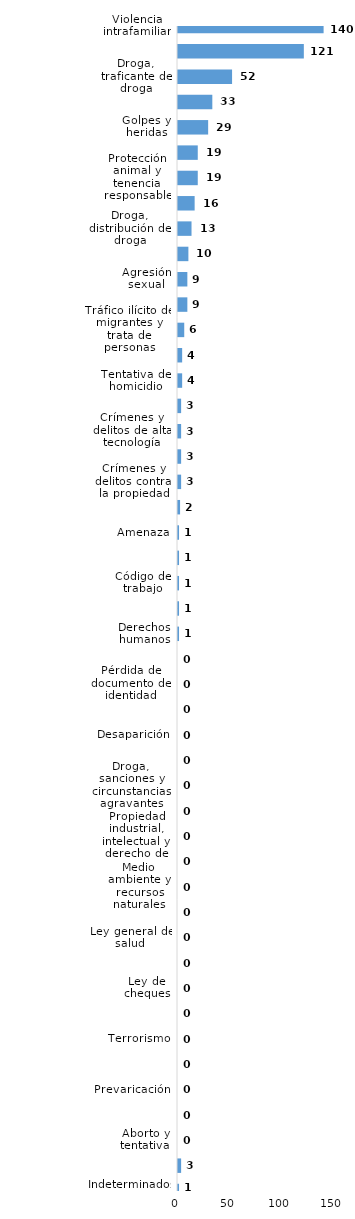
| Category | Series 0 |
|---|---|
| Violencia intrafamiliar | 140 |
| Robo calificado | 121 |
| Droga, traficante de droga | 52 |
| Ley de armas | 33 |
| Golpes y heridas | 29 |
| Código del menor NNA | 19 |
| Protección animal y tenencia responsable | 19 |
| Asociación de malhechores | 16 |
| Droga, distribución de droga | 13 |
| Violación sexual | 10 |
| Agresión sexual | 9 |
| Homicidio | 9 |
| Tráfico ilícito de migrantes y trata de personas | 6 |
| Estafa | 4 |
| Tentativa de homicidio | 4 |
| Violencia de género | 3 |
| Crímenes y delitos de alta tecnología | 3 |
| Falsificación | 3 |
| Crímenes y delitos contra la propiedad | 3 |
| Abuso de confianza | 2 |
| Amenaza | 1 |
| Droga, simple posesión | 1 |
| Código de trabajo | 1 |
| Contra el lavado de activos  | 1 |
| Derechos humanos | 1 |
| Daños y perjuicios a la cosa ajena | 0 |
| Pérdida de documento de identidad | 0 |
| Tránsito y seguridad vial  | 0 |
| Desaparición | 0 |
| Robo simple | 0 |
| Droga, sanciones y circunstancias agravantes | 0 |
| Difamación e injuria | 0 |
| Propiedad industrial, intelectual y derecho de autor | 0 |
| Conflictos sociales | 0 |
| Medio ambiente y recursos naturales | 0 |
| Secuestro | 0 |
| Ley general de salud | 0 |
| Juegos de azar | 0 |
| Ley de cheques | 0 |
| Proxenetismo | 0 |
| Terrorismo | 0 |
| Soborno | 0 |
| Prevaricación | 0 |
| Droga, delitos y sanciones | 0 |
| Aborto y tentativa | 0 |
| Otros | 3 |
| Indeterminados | 1 |